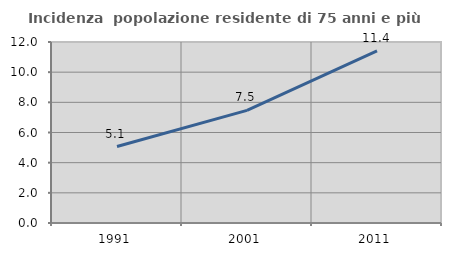
| Category | Incidenza  popolazione residente di 75 anni e più |
|---|---|
| 1991.0 | 5.07 |
| 2001.0 | 7.466 |
| 2011.0 | 11.407 |